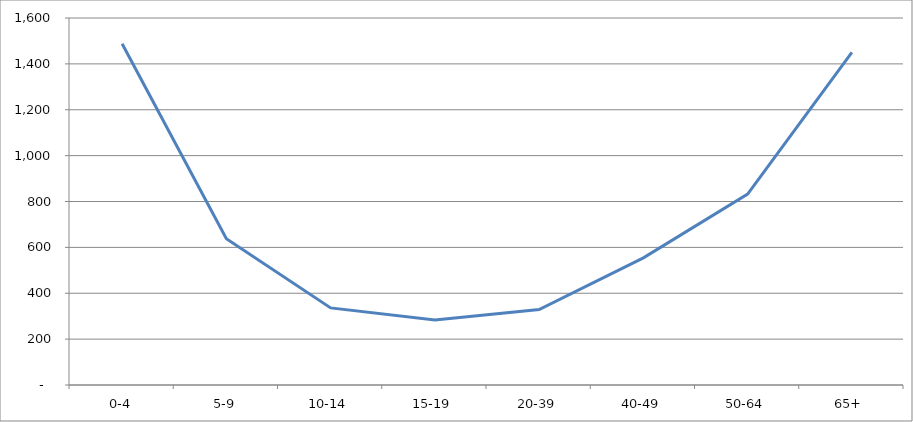
| Category | Series 0 |
|---|---|
| 0-4 | 1488.077 |
| 5-9 | 637.837 |
| 10-14 | 336.084 |
| 15-19 | 283.412 |
| 20-39 | 328.675 |
| 40-49 | 554.12 |
| 50-64 | 832.625 |
| 65+ | 1450.565 |